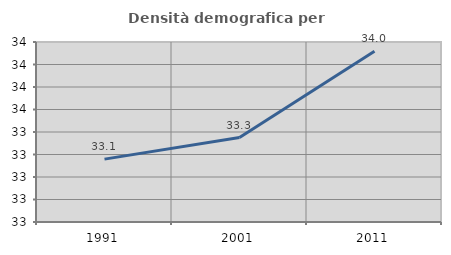
| Category | Densità demografica |
|---|---|
| 1991.0 | 33.059 |
| 2001.0 | 33.251 |
| 2011.0 | 34.019 |